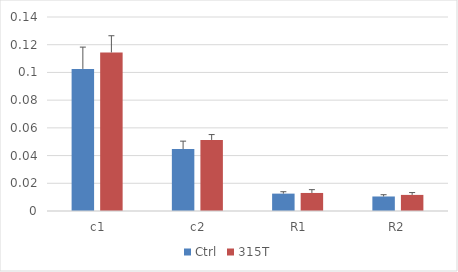
| Category | Ctrl | 315T |
|---|---|---|
|  c1 | 0.103 | 0.114 |
|  c2 | 0.045 | 0.051 |
|  R1 | 0.013 | 0.013 |
| R2 | 0.01 | 0.012 |